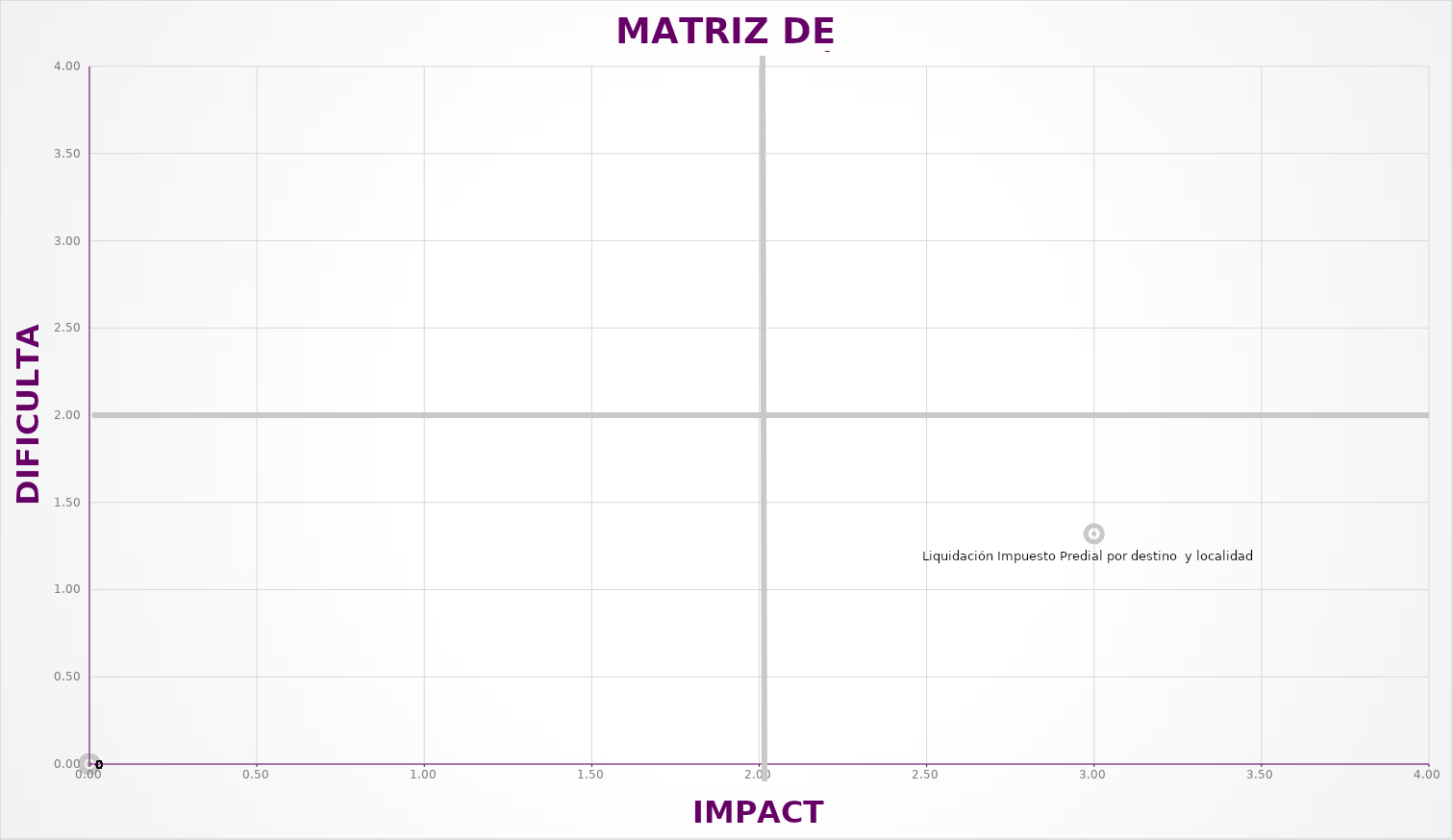
| Category | Series 0 |
|---|---|
| 3.0 | 1.32 |
| 0.0 | 0 |
| 0.0 | 0 |
| 0.0 | 0 |
| 0.0 | 0 |
| 0.0 | 0 |
| 0.0 | 0 |
| 0.0 | 0 |
| 0.0 | 0 |
| 0.0 | 0 |
| 0.0 | 0 |
| 0.0 | 0 |
| 0.0 | 0 |
| 0.0 | 0 |
| 0.0 | 0 |
| 0.0 | 0 |
| 0.0 | 0 |
| 0.0 | 0 |
| 0.0 | 0 |
| 0.0 | 0 |
| 0.0 | 0 |
| 0.0 | 0 |
| 0.0 | 0 |
| 0.0 | 0 |
| 0.0 | 0 |
| 0.0 | 0 |
| 0.0 | 0 |
| 0.0 | 0 |
| 0.0 | 0 |
| 0.0 | 0 |
| 0.0 | 0 |
| 0.0 | 0 |
| 0.0 | 0 |
| 0.0 | 0 |
| 0.0 | 0 |
| 0.0 | 0 |
| 0.0 | 0 |
| 0.0 | 0 |
| 0.0 | 0 |
| 0.0 | 0 |
| 0.0 | 0 |
| 0.0 | 0 |
| 0.0 | 0 |
| 0.0 | 0 |
| 0.0 | 0 |
| 0.0 | 0 |
| 0.0 | 0 |
| 0.0 | 0 |
| 0.0 | 0 |
| 0.0 | 0 |
| 0.0 | 0 |
| 0.0 | 0 |
| 0.0 | 0 |
| 0.0 | 0 |
| 0.0 | 0 |
| 0.0 | 0 |
| 0.0 | 0 |
| 0.0 | 0 |
| 0.0 | 0 |
| 0.0 | 0 |
| 0.0 | 0 |
| 0.0 | 0 |
| 0.0 | 0 |
| 0.0 | 0 |
| 0.0 | 0 |
| 0.0 | 0 |
| 0.0 | 0 |
| 0.0 | 0 |
| 0.0 | 0 |
| 0.0 | 0 |
| 0.0 | 0 |
| 0.0 | 0 |
| 0.0 | 0 |
| 0.0 | 0 |
| 0.0 | 0 |
| 0.0 | 0 |
| 0.0 | 0 |
| 0.0 | 0 |
| 0.0 | 0 |
| 0.0 | 0 |
| 0.0 | 0 |
| 0.0 | 0 |
| 0.0 | 0 |
| 0.0 | 0 |
| 0.0 | 0 |
| 0.0 | 0 |
| 0.0 | 0 |
| 0.0 | 0 |
| 0.0 | 0 |
| 0.0 | 0 |
| 0.0 | 0 |
| 0.0 | 0 |
| 0.0 | 0 |
| 0.0 | 0 |
| 0.0 | 0 |
| 0.0 | 0 |
| 0.0 | 0 |
| 0.0 | 0 |
| 0.0 | 0 |
| 0.0 | 0 |
| 0.0 | 0 |
| 0.0 | 0 |
| 0.0 | 0 |
| 0.0 | 0 |
| 0.0 | 0 |
| 0.0 | 0 |
| 0.0 | 0 |
| 0.0 | 0 |
| 0.0 | 0 |
| 0.0 | 0 |
| 0.0 | 0 |
| 0.0 | 0 |
| 0.0 | 0 |
| 0.0 | 0 |
| 0.0 | 0 |
| 0.0 | 0 |
| 0.0 | 0 |
| 0.0 | 0 |
| 0.0 | 0 |